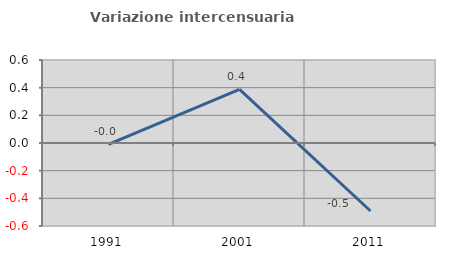
| Category | Variazione intercensuaria annua |
|---|---|
| 1991.0 | -0.009 |
| 2001.0 | 0.387 |
| 2011.0 | -0.492 |